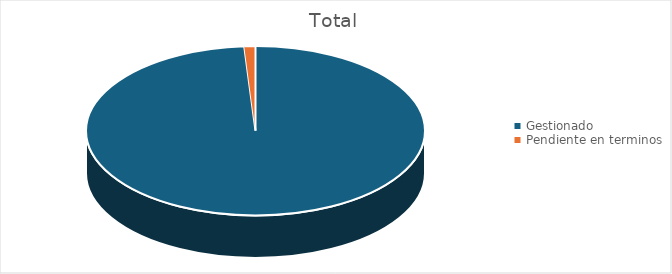
| Category | Total |
|---|---|
| Gestionado | 93 |
| Pendiente en terminos | 1 |